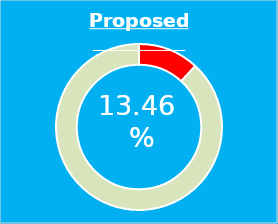
| Category | Series 0 |
|---|---|
| 0 | 1614.865 |
| 1 | 12000.029 |